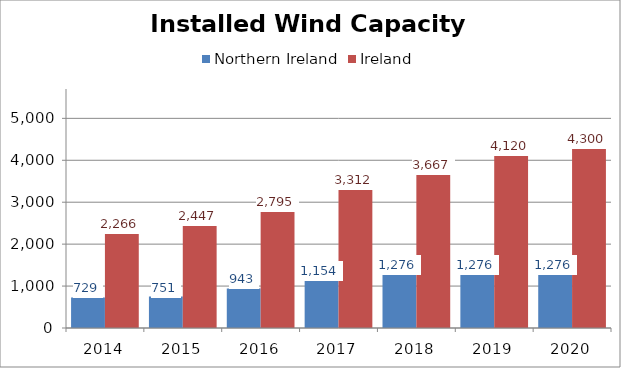
| Category | Northern Ireland | Ireland |
|---|---|---|
| 2014.0 | 729.135 | 2266.417 |
| 2015.0 | 751.025 | 2447.267 |
| 2016.0 | 942.623 | 2794.756 |
| 2017.0 | 1153.718 | 3312.264 |
| 2018.0 | 1276.254 | 3667.038 |
| 2019.0 | 1276.254 | 4119.643 |
| 2020.0 | 1276.254 | 4299.841 |